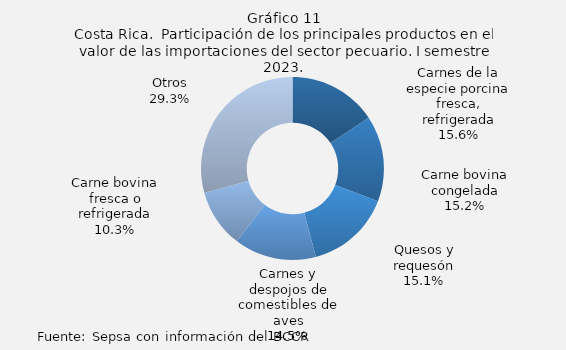
| Category | Series 0 |
|---|---|
| Carnes de la especie porcina fresca, refrigerada | 15.642 |
| Carne bovina congelada | 15.188 |
| Quesos y requesón | 15.06 |
| Carnes y despojos de comestibles de aves | 14.523 |
| Carne bovina fresca o refrigerada | 10.282 |
| Otros | 29.307 |